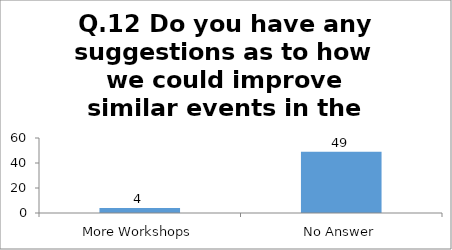
| Category | Q.12 Do you have any suggestions as to how we could improve similar events in the future? |
|---|---|
| More Workshops | 4 |
| No Answer | 49 |